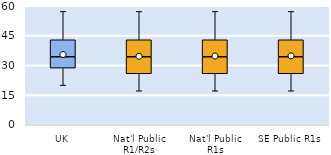
| Category | 25th | 50th | 75th |
|---|---|---|---|
| UK | 28.571 | 5.714 | 8.571 |
| Nat'l Public R1/R2s | 25.714 | 8.571 | 8.571 |
| Nat'l Public R1s | 25.714 | 8.571 | 8.571 |
| SE Public R1s | 25.714 | 8.571 | 8.571 |